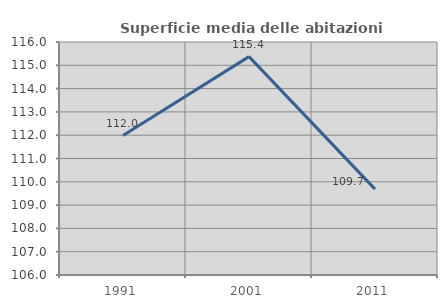
| Category | Superficie media delle abitazioni occupate |
|---|---|
| 1991.0 | 111.986 |
| 2001.0 | 115.372 |
| 2011.0 | 109.687 |